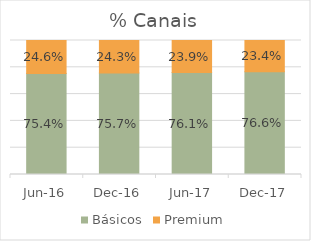
| Category | Básicos | Premium |
|---|---|---|
| 2016-06-01 | 0.754 | 0.246 |
| 2016-12-01 | 0.757 | 0.243 |
| 2017-06-01 | 0.761 | 0.239 |
| 2017-12-01 | 0.766 | 0.234 |